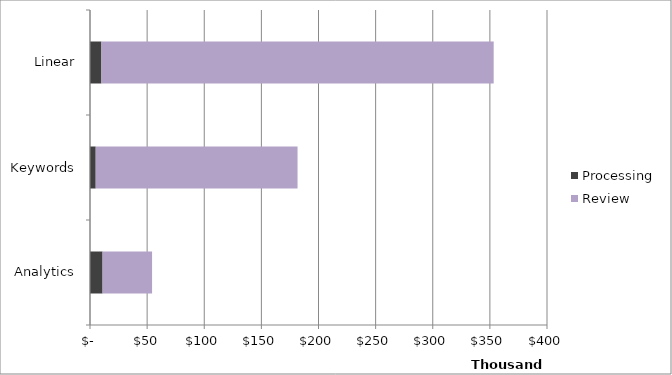
| Category | Processing | Review |
|---|---|---|
| Analytics | 11000 | 43333.333 |
| Keywords | 5000 | 176666.667 |
| Linear | 10000 | 343333.333 |